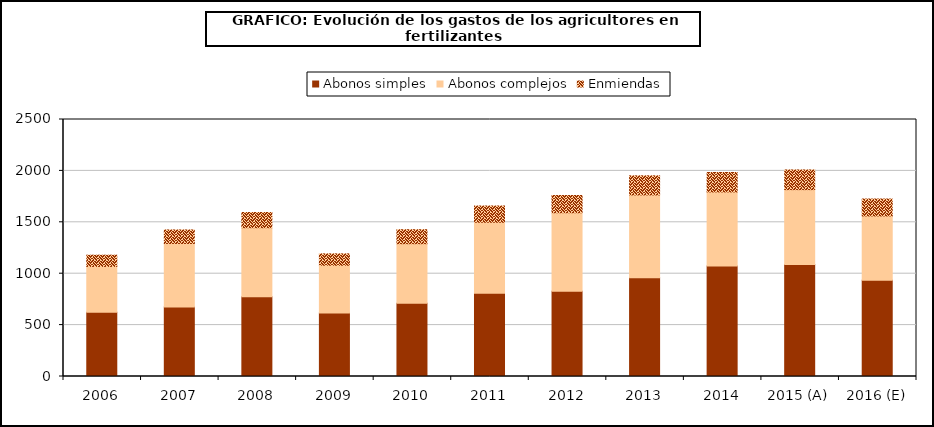
| Category | Abonos simples | Abonos complejos | Enmiendas |
|---|---|---|---|
| 2006 | 623.947 | 446.76 | 109.46 |
| 2007 | 675.341 | 618.526 | 131.725 |
| 2008 | 776.533 | 671.033 | 147.519 |
| 2009 | 617.926 | 464.475 | 110.568 |
| 2010 | 711.864 | 580.242 | 135.989 |
| 2011 | 809.32 | 692.087 | 157.487 |
| 2012 | 828.171 | 764.88 | 167.637 |
| 2013 | 959.679 | 806.665 | 185.766 |
| 2014 | 1074.953 | 720.53 | 188.831 |
| 2015 (A) | 1088.422 | 729.558 | 191.197 |
| 2016 (E) | 935.205 | 626.858 | 164.282 |